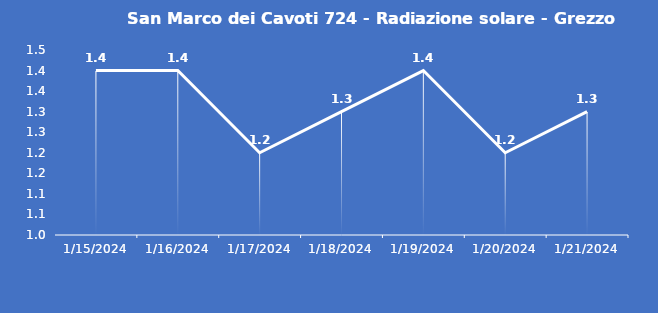
| Category | San Marco dei Cavoti 724 - Radiazione solare - Grezzo (W/m2) |
|---|---|
| 1/15/24 | 1.4 |
| 1/16/24 | 1.4 |
| 1/17/24 | 1.2 |
| 1/18/24 | 1.3 |
| 1/19/24 | 1.4 |
| 1/20/24 | 1.2 |
| 1/21/24 | 1.3 |